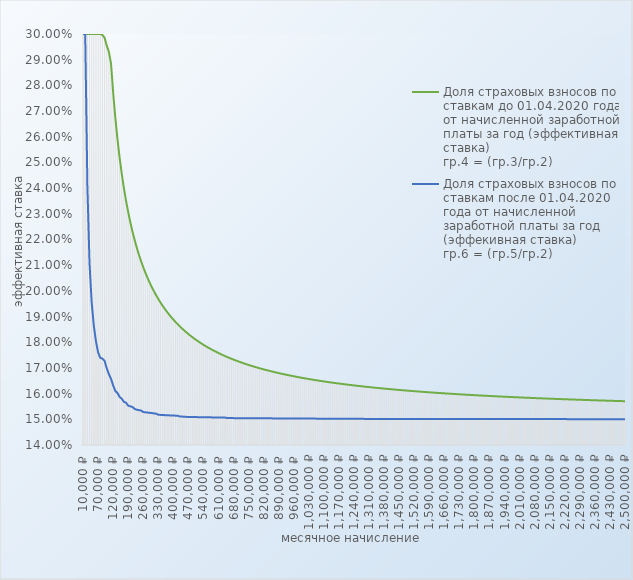
| Category | Доля страховых взносов по ставкам до 01.04.2020 года от начисленной заработной платы за год (эффективная ставка)
гр.4 = (гр.3/гр.2) | Доля страховых взносов по ставкам после 01.04.2020 года от начисленной заработной платы за год (эффекивная ставка) 
гр.6 = (гр.5/гр.2) |
|---|---|---|
| 10000.0 | 0.3 | 0.3 |
| 12130.0 | 0.3 | 0.3 |
| 20000.0 | 0.3 | 0.241 |
| 30000.0 | 0.3 | 0.211 |
| 40000.0 | 0.3 | 0.195 |
| 50000.0 | 0.3 | 0.186 |
| 60000.0 | 0.3 | 0.18 |
| 70000.0 | 0.3 | 0.176 |
| 76000.0 | 0.3 | 0.174 |
| 77000.0 | 0.3 | 0.174 |
| 80000.0 | 0.299 | 0.173 |
| 90000.0 | 0.295 | 0.17 |
| 100000.0 | 0.293 | 0.168 |
| 110000.0 | 0.288 | 0.166 |
| 120000.0 | 0.277 | 0.163 |
| 130000.0 | 0.267 | 0.161 |
| 140000.0 | 0.259 | 0.16 |
| 150000.0 | 0.252 | 0.159 |
| 160000.0 | 0.246 | 0.158 |
| 170000.0 | 0.24 | 0.157 |
| 180000.0 | 0.235 | 0.156 |
| 190000.0 | 0.231 | 0.155 |
| 200000.0 | 0.227 | 0.155 |
| 210000.0 | 0.223 | 0.155 |
| 220000.0 | 0.22 | 0.154 |
| 230000.0 | 0.217 | 0.154 |
| 240000.0 | 0.214 | 0.154 |
| 250000.0 | 0.211 | 0.153 |
| 260000.0 | 0.209 | 0.153 |
| 270000.0 | 0.207 | 0.153 |
| 280000.0 | 0.205 | 0.153 |
| 290000.0 | 0.203 | 0.153 |
| 300000.0 | 0.201 | 0.152 |
| 310000.0 | 0.2 | 0.152 |
| 320000.0 | 0.198 | 0.152 |
| 330000.0 | 0.197 | 0.152 |
| 340000.0 | 0.195 | 0.152 |
| 350000.0 | 0.194 | 0.152 |
| 360000.0 | 0.193 | 0.152 |
| 370000.0 | 0.192 | 0.152 |
| 380000.0 | 0.191 | 0.152 |
| 390000.0 | 0.19 | 0.152 |
| 400000.0 | 0.189 | 0.151 |
| 410000.0 | 0.188 | 0.151 |
| 420000.0 | 0.187 | 0.151 |
| 430000.0 | 0.186 | 0.151 |
| 440000.0 | 0.185 | 0.151 |
| 450000.0 | 0.185 | 0.151 |
| 460000.0 | 0.184 | 0.151 |
| 470000.0 | 0.183 | 0.151 |
| 480000.0 | 0.183 | 0.151 |
| 490000.0 | 0.182 | 0.151 |
| 500000.0 | 0.181 | 0.151 |
| 510000.0 | 0.181 | 0.151 |
| 520000.0 | 0.18 | 0.151 |
| 530000.0 | 0.18 | 0.151 |
| 540000.0 | 0.179 | 0.151 |
| 550000.0 | 0.178 | 0.151 |
| 560000.0 | 0.178 | 0.151 |
| 570000.0 | 0.178 | 0.151 |
| 580000.0 | 0.177 | 0.151 |
| 590000.0 | 0.177 | 0.151 |
| 600000.0 | 0.176 | 0.151 |
| 610000.0 | 0.176 | 0.151 |
| 620000.0 | 0.175 | 0.151 |
| 630000.0 | 0.175 | 0.151 |
| 640000.0 | 0.175 | 0.151 |
| 650000.0 | 0.174 | 0.15 |
| 660000.0 | 0.174 | 0.15 |
| 670000.0 | 0.174 | 0.15 |
| 680000.0 | 0.173 | 0.15 |
| 690000.0 | 0.173 | 0.15 |
| 700000.0 | 0.173 | 0.15 |
| 710000.0 | 0.172 | 0.15 |
| 720000.0 | 0.172 | 0.15 |
| 730000.0 | 0.172 | 0.15 |
| 740000.0 | 0.171 | 0.15 |
| 750000.0 | 0.171 | 0.15 |
| 760000.0 | 0.171 | 0.15 |
| 770000.0 | 0.171 | 0.15 |
| 780000.0 | 0.17 | 0.15 |
| 790000.0 | 0.17 | 0.15 |
| 800000.0 | 0.17 | 0.15 |
| 810000.0 | 0.17 | 0.15 |
| 820000.0 | 0.169 | 0.15 |
| 830000.0 | 0.169 | 0.15 |
| 840000.0 | 0.169 | 0.15 |
| 850000.0 | 0.169 | 0.15 |
| 860000.0 | 0.169 | 0.15 |
| 870000.0 | 0.168 | 0.15 |
| 880000.0 | 0.168 | 0.15 |
| 890000.0 | 0.168 | 0.15 |
| 900000.0 | 0.168 | 0.15 |
| 910000.0 | 0.168 | 0.15 |
| 920000.0 | 0.167 | 0.15 |
| 930000.0 | 0.167 | 0.15 |
| 940000.0 | 0.167 | 0.15 |
| 950000.0 | 0.167 | 0.15 |
| 960000.0 | 0.167 | 0.15 |
| 970000.0 | 0.167 | 0.15 |
| 980000.0 | 0.166 | 0.15 |
| 990000.0 | 0.166 | 0.15 |
| 1000000.0 | 0.166 | 0.15 |
| 1010000.0 | 0.166 | 0.15 |
| 1020000.0 | 0.166 | 0.15 |
| 1030000.0 | 0.166 | 0.15 |
| 1040000.0 | 0.166 | 0.15 |
| 1050000.0 | 0.165 | 0.15 |
| 1060000.0 | 0.165 | 0.15 |
| 1070000.0 | 0.165 | 0.15 |
| 1080000.0 | 0.165 | 0.15 |
| 1090000.0 | 0.165 | 0.15 |
| 1100000.0 | 0.165 | 0.15 |
| 1110000.0 | 0.165 | 0.15 |
| 1120000.0 | 0.165 | 0.15 |
| 1130000.0 | 0.164 | 0.15 |
| 1140000.0 | 0.164 | 0.15 |
| 1150000.0 | 0.164 | 0.15 |
| 1160000.0 | 0.164 | 0.15 |
| 1170000.0 | 0.164 | 0.15 |
| 1180000.0 | 0.164 | 0.15 |
| 1190000.0 | 0.164 | 0.15 |
| 1200000.0 | 0.164 | 0.15 |
| 1210000.0 | 0.163 | 0.15 |
| 1220000.0 | 0.163 | 0.15 |
| 1230000.0 | 0.163 | 0.15 |
| 1240000.0 | 0.163 | 0.15 |
| 1250000.0 | 0.163 | 0.15 |
| 1260000.0 | 0.163 | 0.15 |
| 1270000.0 | 0.163 | 0.15 |
| 1280000.0 | 0.163 | 0.15 |
| 1290000.0 | 0.163 | 0.15 |
| 1300000.0 | 0.163 | 0.15 |
| 1310000.0 | 0.163 | 0.15 |
| 1320000.0 | 0.162 | 0.15 |
| 1330000.0 | 0.162 | 0.15 |
| 1340000.0 | 0.162 | 0.15 |
| 1350000.0 | 0.162 | 0.15 |
| 1360000.0 | 0.162 | 0.15 |
| 1370000.0 | 0.162 | 0.15 |
| 1380000.0 | 0.162 | 0.15 |
| 1390000.0 | 0.162 | 0.15 |
| 1400000.0 | 0.162 | 0.15 |
| 1410000.0 | 0.162 | 0.15 |
| 1420000.0 | 0.162 | 0.15 |
| 1430000.0 | 0.162 | 0.15 |
| 1440000.0 | 0.162 | 0.15 |
| 1450000.0 | 0.161 | 0.15 |
| 1460000.0 | 0.161 | 0.15 |
| 1470000.0 | 0.161 | 0.15 |
| 1480000.0 | 0.161 | 0.15 |
| 1490000.0 | 0.161 | 0.15 |
| 1500000.0 | 0.161 | 0.15 |
| 1510000.0 | 0.161 | 0.15 |
| 1520000.0 | 0.161 | 0.15 |
| 1530000.0 | 0.161 | 0.15 |
| 1540000.0 | 0.161 | 0.15 |
| 1550000.0 | 0.161 | 0.15 |
| 1560000.0 | 0.161 | 0.15 |
| 1570000.0 | 0.161 | 0.15 |
| 1580000.0 | 0.161 | 0.15 |
| 1590000.0 | 0.161 | 0.15 |
| 1600000.0 | 0.16 | 0.15 |
| 1610000.0 | 0.16 | 0.15 |
| 1620000.0 | 0.16 | 0.15 |
| 1630000.0 | 0.16 | 0.15 |
| 1640000.0 | 0.16 | 0.15 |
| 1650000.0 | 0.16 | 0.15 |
| 1660000.0 | 0.16 | 0.15 |
| 1670000.0 | 0.16 | 0.15 |
| 1680000.0 | 0.16 | 0.15 |
| 1690000.0 | 0.16 | 0.15 |
| 1700000.0 | 0.16 | 0.15 |
| 1710000.0 | 0.16 | 0.15 |
| 1720000.0 | 0.16 | 0.15 |
| 1730000.0 | 0.16 | 0.15 |
| 1740000.0 | 0.16 | 0.15 |
| 1750000.0 | 0.16 | 0.15 |
| 1760000.0 | 0.16 | 0.15 |
| 1770000.0 | 0.16 | 0.15 |
| 1780000.0 | 0.159 | 0.15 |
| 1790000.0 | 0.159 | 0.15 |
| 1800000.0 | 0.159 | 0.15 |
| 1810000.0 | 0.159 | 0.15 |
| 1820000.0 | 0.159 | 0.15 |
| 1830000.0 | 0.159 | 0.15 |
| 1840000.0 | 0.159 | 0.15 |
| 1850000.0 | 0.159 | 0.15 |
| 1860000.0 | 0.159 | 0.15 |
| 1870000.0 | 0.159 | 0.15 |
| 1880000.0 | 0.159 | 0.15 |
| 1890000.0 | 0.159 | 0.15 |
| 1900000.0 | 0.159 | 0.15 |
| 1910000.0 | 0.159 | 0.15 |
| 1920000.0 | 0.159 | 0.15 |
| 1930000.0 | 0.159 | 0.15 |
| 1940000.0 | 0.159 | 0.15 |
| 1950000.0 | 0.159 | 0.15 |
| 1960000.0 | 0.159 | 0.15 |
| 1970000.0 | 0.159 | 0.15 |
| 1980000.0 | 0.159 | 0.15 |
| 1990000.0 | 0.159 | 0.15 |
| 2000000.0 | 0.159 | 0.15 |
| 2010000.0 | 0.159 | 0.15 |
| 2020000.0 | 0.158 | 0.15 |
| 2030000.0 | 0.158 | 0.15 |
| 2040000.0 | 0.158 | 0.15 |
| 2050000.0 | 0.158 | 0.15 |
| 2060000.0 | 0.158 | 0.15 |
| 2070000.0 | 0.158 | 0.15 |
| 2080000.0 | 0.158 | 0.15 |
| 2090000.0 | 0.158 | 0.15 |
| 2100000.0 | 0.158 | 0.15 |
| 2110000.0 | 0.158 | 0.15 |
| 2120000.0 | 0.158 | 0.15 |
| 2130000.0 | 0.158 | 0.15 |
| 2140000.0 | 0.158 | 0.15 |
| 2150000.0 | 0.158 | 0.15 |
| 2160000.0 | 0.158 | 0.15 |
| 2170000.0 | 0.158 | 0.15 |
| 2180000.0 | 0.158 | 0.15 |
| 2190000.0 | 0.158 | 0.15 |
| 2200000.0 | 0.158 | 0.15 |
| 2210000.0 | 0.158 | 0.15 |
| 2220000.0 | 0.158 | 0.15 |
| 2230000.0 | 0.158 | 0.15 |
| 2240000.0 | 0.158 | 0.15 |
| 2250000.0 | 0.158 | 0.15 |
| 2260000.0 | 0.158 | 0.15 |
| 2270000.0 | 0.158 | 0.15 |
| 2280000.0 | 0.158 | 0.15 |
| 2290000.0 | 0.158 | 0.15 |
| 2300000.0 | 0.158 | 0.15 |
| 2310000.0 | 0.158 | 0.15 |
| 2320000.0 | 0.158 | 0.15 |
| 2330000.0 | 0.157 | 0.15 |
| 2340000.0 | 0.157 | 0.15 |
| 2350000.0 | 0.157 | 0.15 |
| 2360000.0 | 0.157 | 0.15 |
| 2370000.0 | 0.157 | 0.15 |
| 2380000.0 | 0.157 | 0.15 |
| 2390000.0 | 0.157 | 0.15 |
| 2400000.0 | 0.157 | 0.15 |
| 2410000.0 | 0.157 | 0.15 |
| 2420000.0 | 0.157 | 0.15 |
| 2430000.0 | 0.157 | 0.15 |
| 2440000.0 | 0.157 | 0.15 |
| 2450000.0 | 0.157 | 0.15 |
| 2460000.0 | 0.157 | 0.15 |
| 2470000.0 | 0.157 | 0.15 |
| 2480000.0 | 0.157 | 0.15 |
| 2490000.0 | 0.157 | 0.15 |
| 2500000.0 | 0.157 | 0.15 |